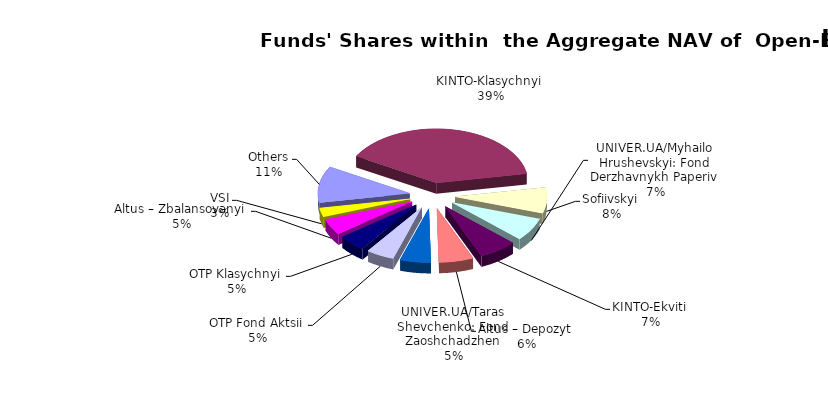
| Category | Series 0 | Series 1 |
|---|---|---|
| Others | 6523355.56 | 0.109 |
| KINTO-Klasychnyi | 23273213.83 | 0.391 |
| Sofiivskyi | 4600079.085 | 0.077 |
| UNIVER.UA/Myhailo Hrushevskyi: Fond Derzhavnykh Paperiv | 4131911.34 | 0.069 |
| KINTO-Ekviti | 4003720 | 0.067 |
| Altus – Depozyt | 3613582.59 | 0.061 |
| UNIVER.UA/Taras Shevchenko: Fond Zaoshchadzhen | 3208070.35 | 0.054 |
| OTP Fond Aktsii | 2925552.95 | 0.049 |
| ОТP Klasychnyi | 2914202.78 | 0.049 |
| Altus – Zbalansovanyi | 2815775.98 | 0.047 |
| VSI | 1578521.76 | 0.026 |